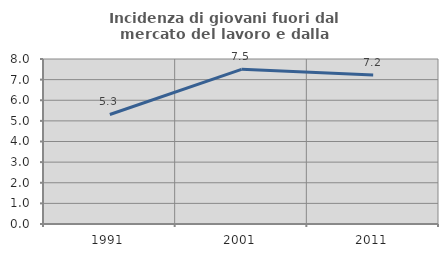
| Category | Incidenza di giovani fuori dal mercato del lavoro e dalla formazione  |
|---|---|
| 1991.0 | 5.31 |
| 2001.0 | 7.5 |
| 2011.0 | 7.229 |